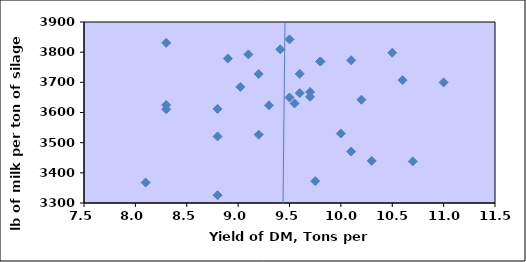
| Category | Series 0 |
|---|---|
| 10.0 | 3530.25 |
| 9.5 | 3842.25 |
| 10.7 | 3437.75 |
| 9.410288938426621 | 3809.5 |
| 9.02160837529406 | 3684.75 |
| 8.3 | 3625 |
| 9.55 | 3630 |
| 9.1 | 3792.5 |
| 10.6 | 3707.25 |
| 11.0 | 3699.75 |
| 9.5 | 3649.75 |
| 8.9 | 3778.8 |
| 10.5 | 3798.25 |
| 10.2 | 3642.25 |
| 9.7 | 3668 |
| 9.75 | 3372.5 |
| 8.1 | 3367.75 |
| 8.8 | 3325.75 |
| 9.2 | 3526.5 |
| 9.2 | 3727.5 |
| 9.8 | 3769 |
| 9.8 | 3769 |
| 9.3 | 3623.75 |
| 9.7 | 3652 |
| 9.6 | 3664.5 |
| 8.3 | 3831 |
| 8.3 | 3610.75 |
| 9.6 | 3728 |
| 10.1 | 3773.25 |
| 8.8 | 3612 |
| 8.8 | 3520.75 |
| 10.1 | 3470.5 |
| 10.3 | 3439.5 |